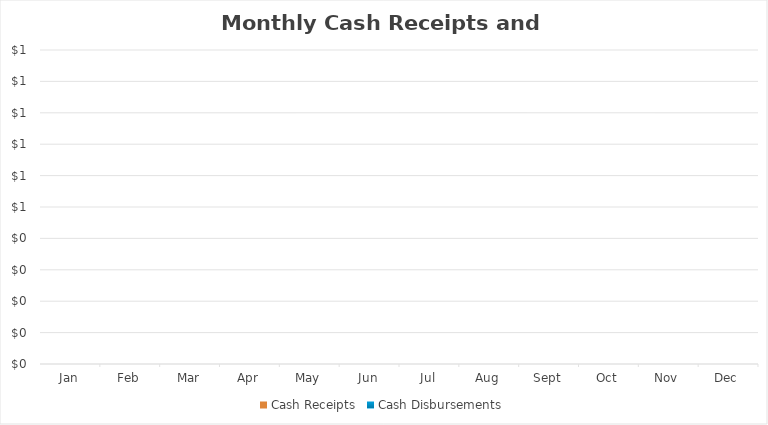
| Category | Cash Receipts | Cash Disbursements |
|---|---|---|
| 2017-01-01 | 0 | 0 |
| 2017-02-01 | 0 | 0 |
| 2017-03-01 | 0 | 0 |
| 2017-04-01 | 0 | 0 |
| 2017-05-01 | 0 | 0 |
| 2017-06-01 | 0 | 0 |
| 2017-07-01 | 0 | 0 |
| 2017-08-01 | 0 | 0 |
| 2017-09-01 | 0 | 0 |
| 2017-10-01 | 0 | 0 |
| 2017-11-01 | 0 | 0 |
| 2017-12-01 | 0 | 0 |